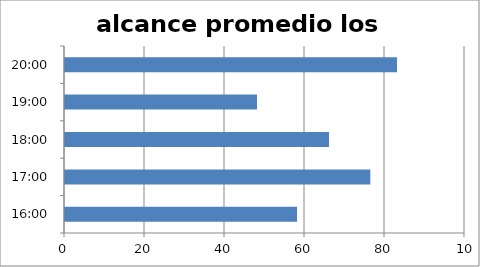
| Category | alcance promedio |
|---|---|
| 0.6666666666666666 | 58 |
| 0.708333333333333 | 76.333 |
| 0.75 | 66 |
| 0.791666666666667 | 48 |
| 0.833333333333333 | 83 |